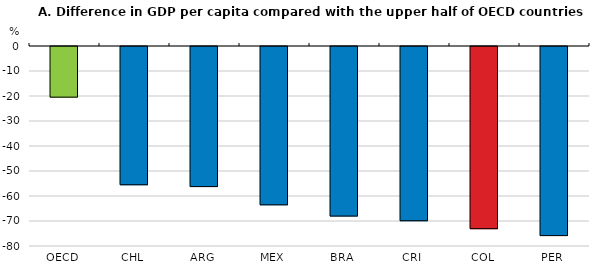
| Category | Series 0 |
|---|---|
| OECD | -20.258 |
| CHL | -55.309 |
| ARG | -56.049 |
| MEX | -63.343 |
| BRA | -67.828 |
| CRI | -69.697 |
| COL | -72.868 |
| PER | -75.647 |